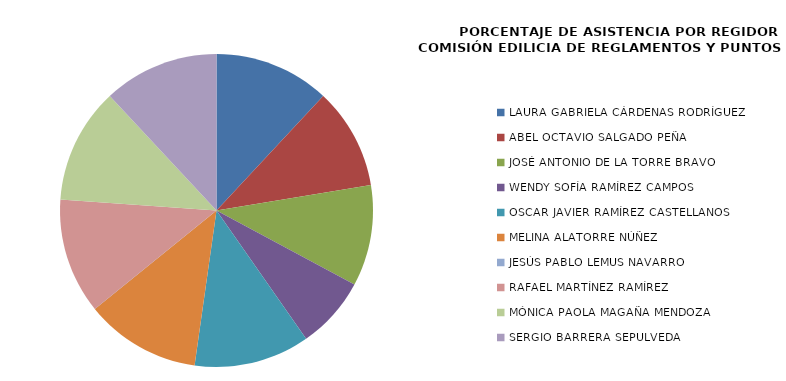
| Category | Series 0 |
|---|---|
| LAURA GABRIELA CÁRDENAS RODRÍGUEZ | 100 |
| ABEL OCTAVIO SALGADO PEÑA | 87.5 |
| JOSÉ ANTONIO DE LA TORRE BRAVO | 87.5 |
| WENDY SOFÍA RAMÍREZ CAMPOS | 62.5 |
| OSCAR JAVIER RAMÍREZ CASTELLANOS | 100 |
| MELINA ALATORRE NÚÑEZ | 100 |
| JESÚS PABLO LEMUS NAVARRO | 0 |
| RAFAEL MARTÍNEZ RAMÍREZ | 100 |
| MÓNICA PAOLA MAGAÑA MENDOZA | 100 |
| SERGIO BARRERA SEPULVEDA | 100 |